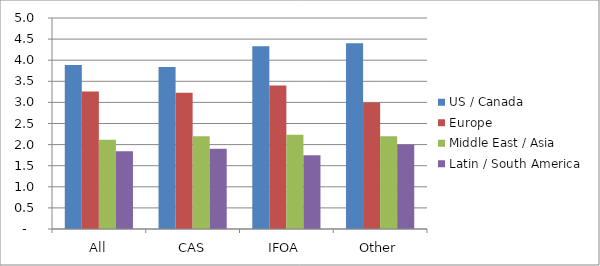
| Category | US / Canada | Europe | Middle East / Asia | Latin / South America |
|---|---|---|---|---|
| All | 3.889 | 3.258 | 2.115 | 1.842 |
| CAS | 3.84 | 3.231 | 2.2 | 1.9 |
| IFOA | 4.333 | 3.4 | 2.231 | 1.75 |
| Other | 4.4 | 3 | 2.2 | 2 |